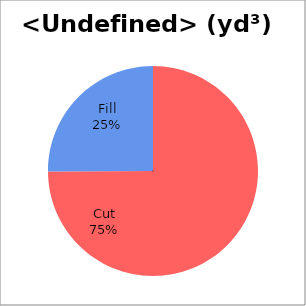
| Category | Series 0 |
|---|---|
| Cut | 16470.222 |
| Fill | 5512.035 |